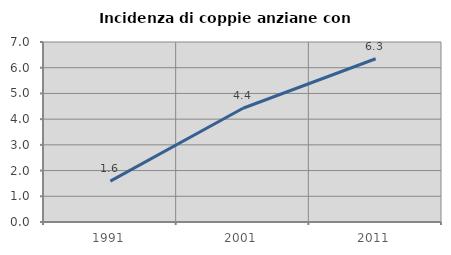
| Category | Incidenza di coppie anziane con figli |
|---|---|
| 1991.0 | 1.587 |
| 2001.0 | 4.425 |
| 2011.0 | 6.349 |